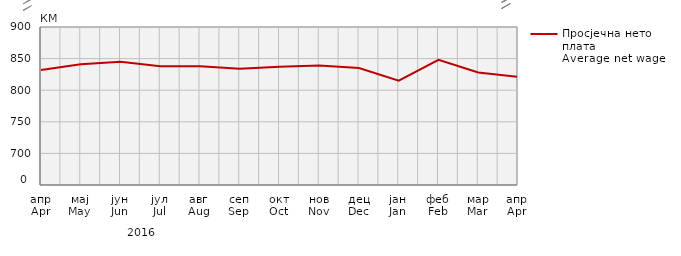
| Category | Просјечна нето плата
Average net wage |
|---|---|
| апр
Apr | 832 |
| мај
May | 841 |
| јун
Jun | 845 |
| јул
Jul | 838 |
| авг
Aug | 838 |
| сеп
Sep | 834 |
| окт
Oct | 837 |
| нов
Nov | 839 |
| дец
Dec | 835 |
| јан
Jan | 815 |
| феб
Feb | 848 |
| мар
Mar | 828 |
| апр
Apr | 821 |